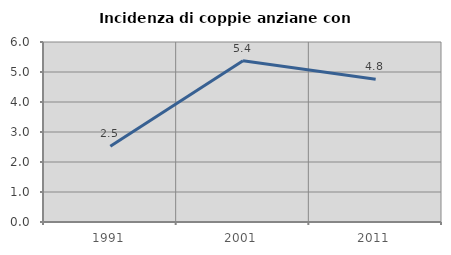
| Category | Incidenza di coppie anziane con figli |
|---|---|
| 1991.0 | 2.526 |
| 2001.0 | 5.376 |
| 2011.0 | 4.762 |